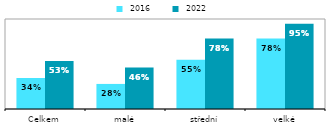
| Category |  2016 |  2022 |
|---|---|---|
| Celkem | 0.344 | 0.534 |
| malé | 0.279 | 0.46 |
| střední | 0.547 | 0.783 |
| velké | 0.783 | 0.948 |